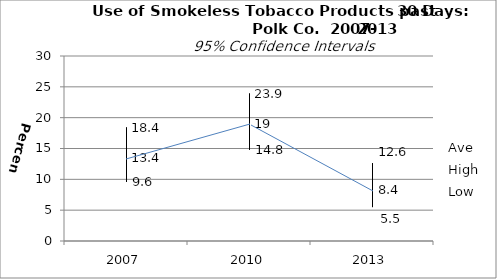
| Category | Ave | High | Low |
|---|---|---|---|
| 2007.0 | 13.4 | 18.4 | 9.6 |
| 2010.0 | 19 | 23.9 | 14.8 |
| 2013.0 | 8.4 | 12.6 | 5.5 |